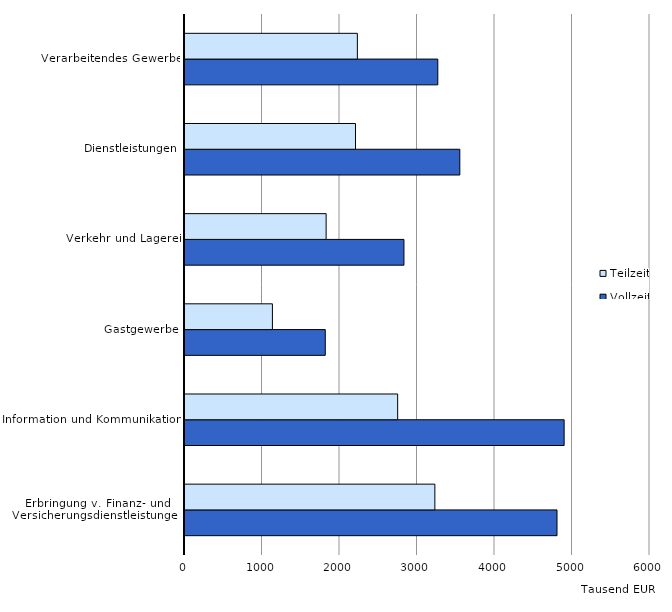
| Category | Vollzeit | Teilzeit |
|---|---|---|
| Erbringung v. Finanz- und Versicherungsdienstleistungen | 4800 | 3224 |
| Information und Kommunikation | 4892 | 2744 |
| Gastgewerbe | 1810 | 1128 |
| Verkehr und Lagerei | 2825 | 1821 |
| Dienstleistungen | 3546 | 2200 |
| Verarbeitendes Gewerbe | 3262 | 2224 |